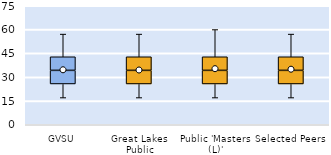
| Category | 25th | 50th | 75th |
|---|---|---|---|
| GVSU | 25.714 | 8.571 | 8.571 |
| Great Lakes Public | 25.714 | 8.571 | 8.571 |
| Public 'Masters (L)' | 25.714 | 8.571 | 8.571 |
| Selected Peers | 25.714 | 8.571 | 8.571 |